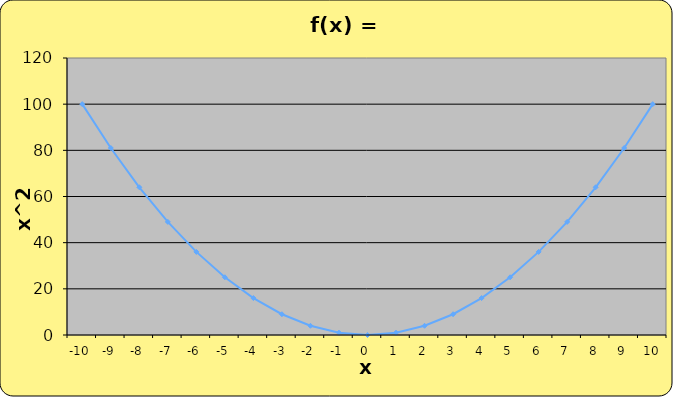
| Category | Series 0 |
|---|---|
| -10.0 | 100 |
| -9.0 | 81 |
| -8.0 | 64 |
| -7.0 | 49 |
| -6.0 | 36 |
| -5.0 | 25 |
| -4.0 | 16 |
| -3.0 | 9 |
| -2.0 | 4 |
| -1.0 | 1 |
| 0.0 | 0 |
| 1.0 | 1 |
| 2.0 | 4 |
| 3.0 | 9 |
| 4.0 | 16 |
| 5.0 | 25 |
| 6.0 | 36 |
| 7.0 | 49 |
| 8.0 | 64 |
| 9.0 | 81 |
| 10.0 | 100 |